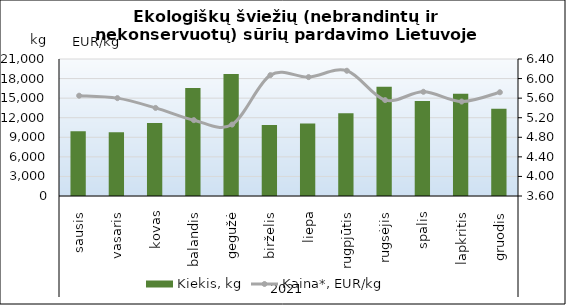
| Category | Kiekis, kg |
|---|---|
| 0 | 9912 |
| 1 | 9760 |
| 2 | 11200 |
| 3 | 16557 |
| 4 | 18684 |
| 5 | 10894 |
| 6 | 11121 |
| 7 | 12689 |
| 8 | 16761 |
| 9 | 14547 |
| 10 | 15688 |
| 11 | 13390 |